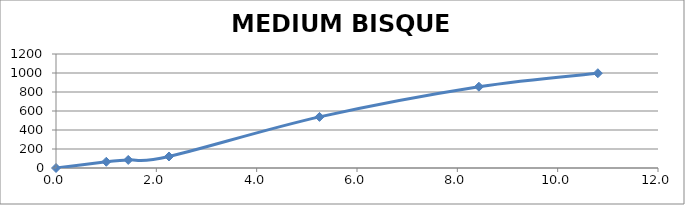
| Category | MEDIUM BISQUE CHART |
|---|---|
| 0.0 | 0 |
| 1.0025 | 65.556 |
| 1.44 | 85 |
| 2.2525 | 121.111 |
| 5.252500000000001 | 537.778 |
| 8.43028 | 855.556 |
| 10.80064666666667 | 997.778 |